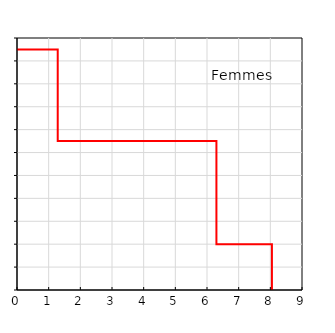
| Category | Femmes |
|---|---|
| 8.050032071840924 | 0 |
| 8.050032071840924 | 20 |
| 6.297484142256432 | 20 |
| 6.297484142256432 | 65 |
| 1.2860808210391277 | 65 |
| 1.2860808210391277 | 105 |
| 0.0 | 105 |